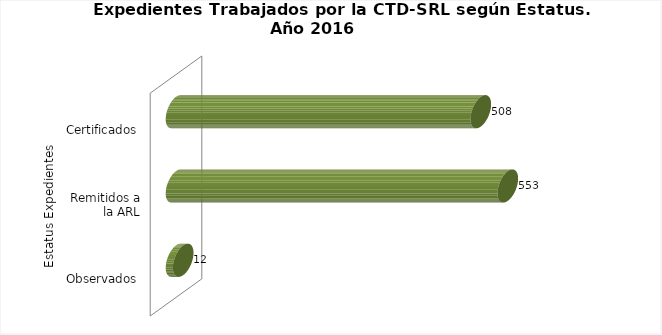
| Category | Total |
|---|---|
| 0 | 12 |
| 1 | 553 |
| 2 | 508 |